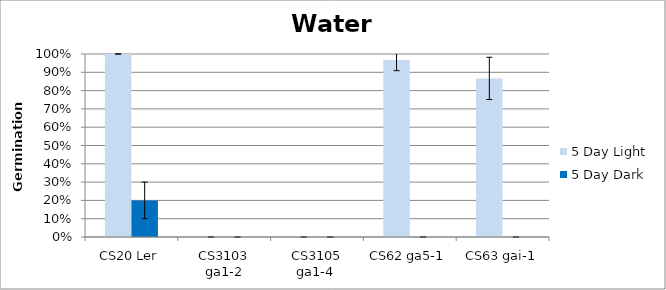
| Category | 5 Day Light | 5 Day Dark |
|---|---|---|
| CS20 Ler | 1 | 0.2 |
| CS3103 ga1-2 | 0 | 0 |
| CS3105 ga1-4  | 0 | 0 |
| CS62 ga5-1 | 0.967 | 0 |
| CS63 gai-1 | 0.867 | 0 |